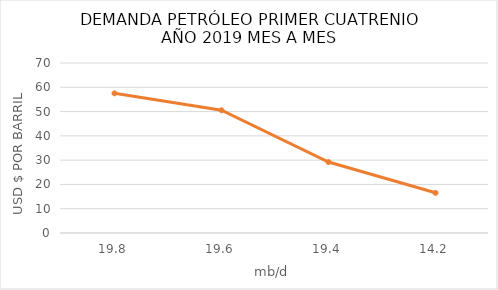
| Category | MILLONES DE BARRILES AL DÍA |
|---|---|
| 19.8 | 57.52 |
| 19.6 | 50.54 |
| 19.4 | 29.21 |
| 14.2 | 16.55 |